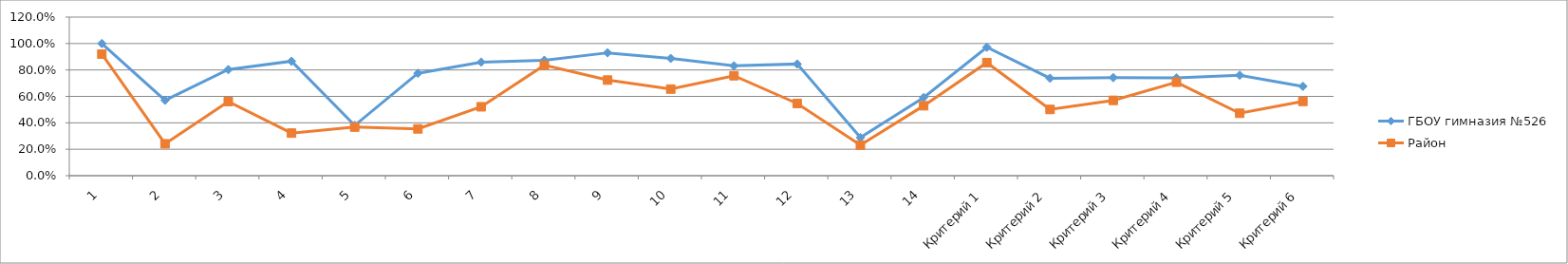
| Category | ГБОУ гимназия №526 | Район |
|---|---|---|
| 1 | 1 | 0.92 |
| 2 | 0.57 | 0.241 |
| 3 | 0.803 | 0.561 |
| 4 | 0.866 | 0.322 |
| 5 | 0.38 | 0.368 |
| 6 | 0.775 | 0.354 |
| 7 | 0.859 | 0.521 |
| 8 | 0.873 | 0.836 |
| 9 | 0.93 | 0.723 |
| 10 | 0.887 | 0.655 |
| 11 | 0.831 | 0.756 |
| 12 | 0.845 | 0.546 |
| 13 | 0.289 | 0.232 |
| 14 | 0.592 | 0.529 |
| Критерий 1 | 0.972 | 0.855 |
| Критерий 2 | 0.737 | 0.501 |
| Критерий 3 | 0.742 | 0.57 |
| Критерий 4 | 0.739 | 0.707 |
| Критерий 5 | 0.761 | 0.472 |
| Критерий 6 | 0.676 | 0.562 |